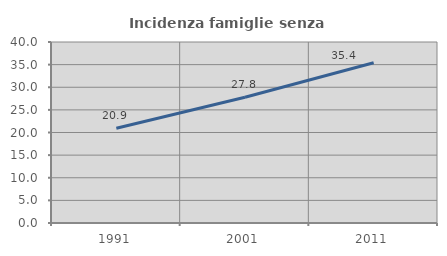
| Category | Incidenza famiglie senza nuclei |
|---|---|
| 1991.0 | 20.949 |
| 2001.0 | 27.778 |
| 2011.0 | 35.415 |